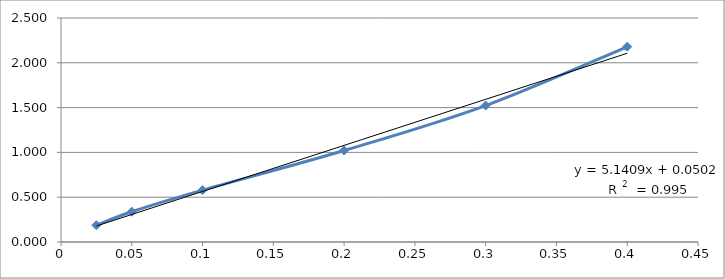
| Category | Series 0 |
|---|---|
| 0.025 | 0.187 |
| 0.05 | 0.338 |
| 0.1 | 0.579 |
| 0.2 | 1.022 |
| 0.3 | 1.523 |
| 0.4 | 2.179 |